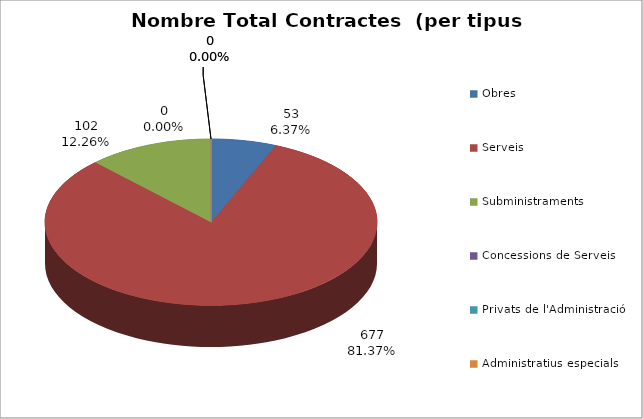
| Category | Nombre Total Contractes |
|---|---|
| Obres | 53 |
| Serveis | 677 |
| Subministraments | 102 |
| Concessions de Serveis | 0 |
| Privats de l'Administració | 0 |
| Administratius especials | 0 |